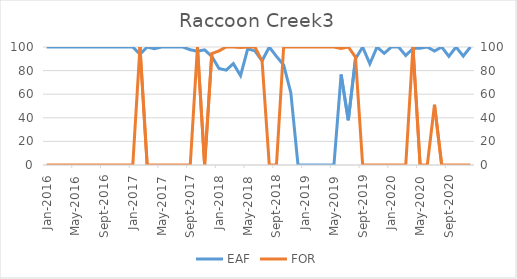
| Category | EAF |
|---|---|
| 2016-01-01 | 100 |
| 2016-02-01 | 100 |
| 2016-03-01 | 100 |
| 2016-04-01 | 100 |
| 2016-05-01 | 100 |
| 2016-06-01 | 100 |
| 2016-07-01 | 100 |
| 2016-08-01 | 100 |
| 2016-09-01 | 100 |
| 2016-10-01 | 100 |
| 2016-11-01 | 100 |
| 2016-12-01 | 100 |
| 2017-01-01 | 100 |
| 2017-02-01 | 93.81 |
| 2017-03-01 | 100 |
| 2017-04-01 | 98.47 |
| 2017-05-01 | 100 |
| 2017-06-01 | 100 |
| 2017-07-01 | 100 |
| 2017-08-01 | 100 |
| 2017-09-01 | 97.64 |
| 2017-10-01 | 96.42 |
| 2017-11-01 | 97.64 |
| 2017-12-01 | 92 |
| 2018-01-01 | 81.82 |
| 2018-02-01 | 80.43 |
| 2018-03-01 | 85.92 |
| 2018-04-01 | 75.77 |
| 2018-05-01 | 98.52 |
| 2018-06-01 | 96.67 |
| 2018-07-01 | 88.31 |
| 2018-08-01 | 100 |
| 2018-09-01 | 92.02 |
| 2018-10-01 | 84.81 |
| 2018-11-01 | 61.3 |
| 2018-12-01 | 0 |
| 2019-01-01 | 0 |
| 2019-02-01 | 0 |
| 2019-03-01 | 0 |
| 2019-04-01 | 0 |
| 2019-05-01 | 0 |
| 2019-06-01 | 76.67 |
| 2019-07-01 | 37.95 |
| 2019-08-01 | 89.96 |
| 2019-09-01 | 100 |
| 2019-10-01 | 85.75 |
| 2019-11-01 | 100 |
| 2019-12-01 | 94.63 |
| 2020-01-01 | 100 |
| 2020-02-01 | 100 |
| 2020-03-01 | 92.73 |
| 2020-04-01 | 98.75 |
| 2020-05-01 | 98.99 |
| 2020-06-01 | 100 |
| 2020-07-01 | 96.58 |
| 2020-08-01 | 100 |
| 2020-09-01 | 92.09 |
| 2020-10-01 | 100 |
| 2020-11-01 | 92.27 |
| 2020-12-01 | 100 |